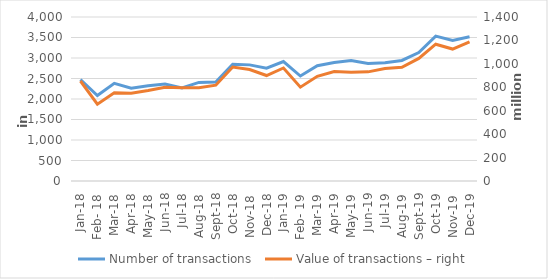
| Category | Number of transactions  |
|---|---|
| sij.18 | 2475117 |
| Feb- 18 | 2083208 |
| ožu.18 | 2382463 |
| tra.18 | 2261002 |
| svi.18 | 2325725 |
| lip.18 | 2364374 |
| srp.18 | 2267955 |
| kol.18 | 2403810 |
| ruj.18 | 2416475 |
| lis.18 | 2845093 |
| stu.18 | 2832385 |
| pro.18 | 2750889 |
| sij.19 | 2913979 |
| Feb- 19 | 2560577 |
| ožu.19 | 2810234 |
| tra.19 | 2888192 |
| svi.19 | 2939289 |
| lip.19 | 2863556 |
| srp.19 | 2885572 |
| kol.19 | 2940650 |
| ruj.19 | 3131352 |
| lis.19 | 3533789 |
| stu.19 | 3425425 |
| pro.19 | 3519880 |